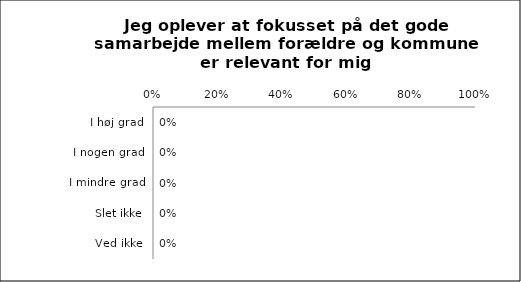
| Category | Fokusset på det gode samarbejde mellem forældre og kommune er relevant for mig |
|---|---|
| I høj grad | 0 |
| I nogen grad | 0 |
| I mindre grad | 0 |
| Slet ikke | 0 |
| Ved ikke | 0 |